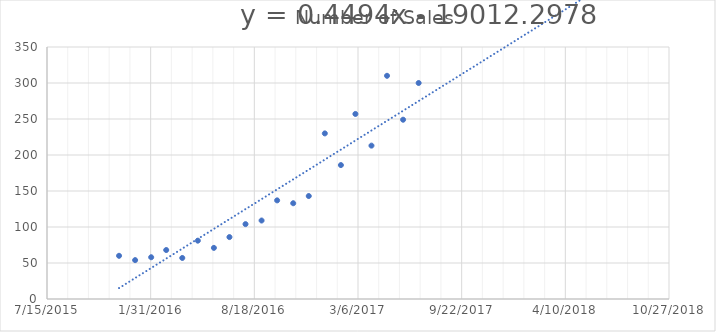
| Category | Number of Sales |
|---|---|
| 42339.0 | 60 |
| 42370.0 | 54 |
| 42401.0 | 58 |
| 42430.0 | 68 |
| 42461.0 | 57 |
| 42491.0 | 81 |
| 42522.0 | 71 |
| 42552.0 | 86 |
| 42583.0 | 104 |
| 42614.0 | 109 |
| 42644.0 | 137 |
| 42675.0 | 133 |
| 42705.0 | 143 |
| 42736.0 | 230 |
| 42767.0 | 186 |
| 42795.0 | 257 |
| 42826.0 | 213 |
| 42856.0 | 310 |
| 42887.0 | 249 |
| 42917.0 | 300 |